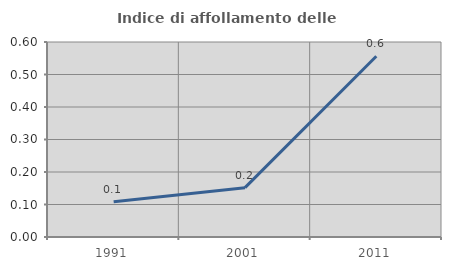
| Category | Indice di affollamento delle abitazioni  |
|---|---|
| 1991.0 | 0.108 |
| 2001.0 | 0.152 |
| 2011.0 | 0.556 |